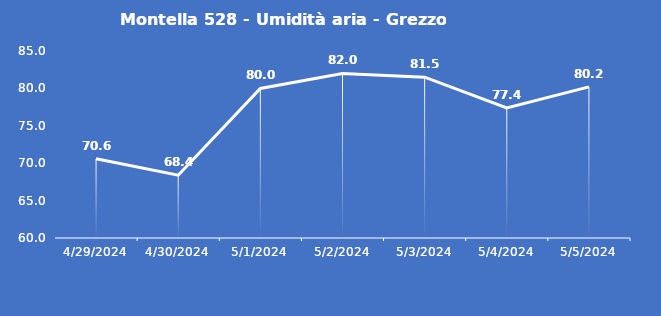
| Category | Montella 528 - Umidità aria - Grezzo (%) |
|---|---|
| 4/29/24 | 70.6 |
| 4/30/24 | 68.4 |
| 5/1/24 | 80 |
| 5/2/24 | 82 |
| 5/3/24 | 81.5 |
| 5/4/24 | 77.4 |
| 5/5/24 | 80.2 |